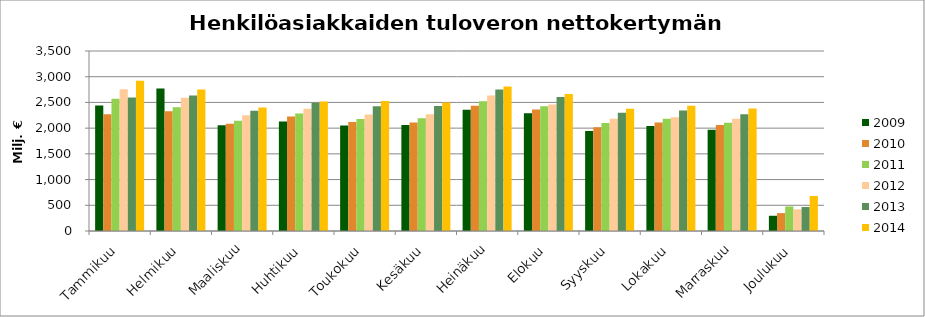
| Category | 2009 | 2010 | 2011 | 2012 | 2013 | 2014 |
|---|---|---|---|---|---|---|
| Tammikuu | 2438.489 | 2267.873 | 2569.442 | 2754.468 | 2597.268 | 2923.115 |
| Helmikuu | 2771.607 | 2330.409 | 2406.04 | 2591.616 | 2636.607 | 2751.009 |
| Maaliskuu | 2054.852 | 2084.249 | 2145.291 | 2250.057 | 2340.316 | 2399.333 |
| Huhtikuu | 2131.066 | 2225.487 | 2285.914 | 2375.631 | 2492.368 | 2520.095 |
| Toukokuu | 2051.558 | 2117.095 | 2177.688 | 2264.689 | 2423.516 | 2528.722 |
| Kesäkuu | 2063.182 | 2109.339 | 2194.481 | 2268.001 | 2432.777 | 2498.654 |
| Heinäkuu | 2357.008 | 2435.026 | 2524.383 | 2633.57 | 2750.145 | 2811.062 |
| Elokuu | 2289.863 | 2364.596 | 2427.052 | 2461.949 | 2607.529 | 2661.459 |
| Syyskuu | 1946.167 | 2019.118 | 2102.001 | 2184.152 | 2299.363 | 2375.832 |
| Lokakuu | 2041.676 | 2107.95 | 2185.045 | 2211.144 | 2342.648 | 2437.263 |
| Marraskuu | 1967.798 | 2063.457 | 2106.752 | 2183.43 | 2270.307 | 2384.008 |
| Joulukuu | 296.354 | 347.927 | 476.484 | 421.857 | 466.039 | 680.69 |